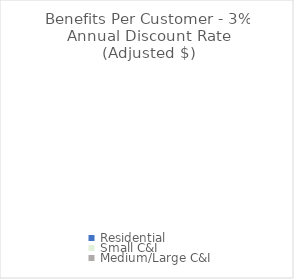
| Category | Benefit Per Customer - 3% Annual Discount Rate (Adjusted $/Customer) |
|---|---|
| Residential | 0 |
| Small C&I | 0 |
| Medium/Large C&I | 0 |